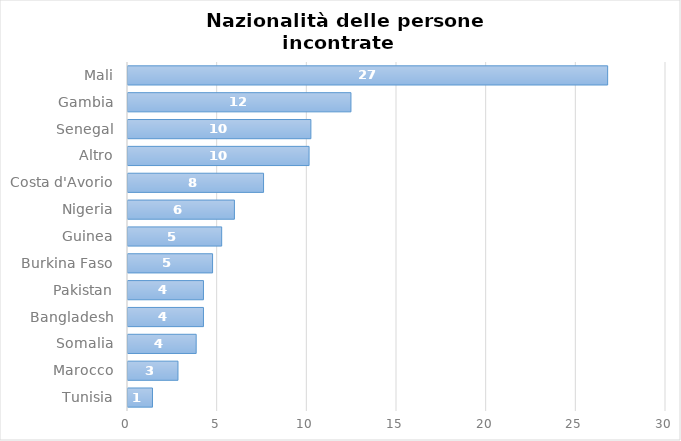
| Category | Series 0 |
|---|---|
| Tunisia | 1.421 |
| Marocco | 2.843 |
| Somalia | 3.858 |
| Bangladesh | 4.264 |
| Pakistan | 4.264 |
| Burkina Faso | 4.772 |
| Guinea | 5.279 |
| Nigeria | 5.99 |
| Costa d'Avorio | 7.614 |
| Altro | 10.152 |
| Senegal | 10.254 |
| Gambia | 12.487 |
| Mali | 26.802 |